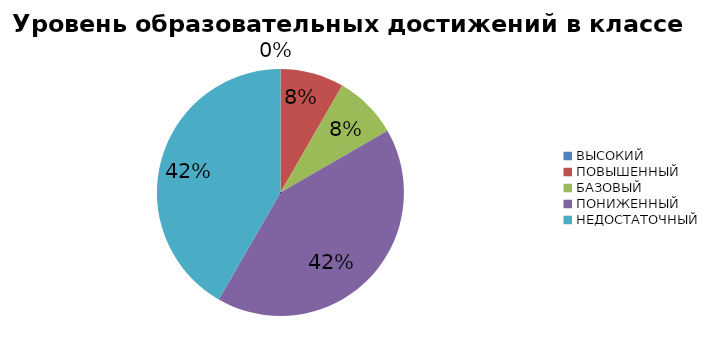
| Category | Series 0 |
|---|---|
| ВЫСОКИЙ | 0 |
| ПОВЫШЕННЫЙ | 8.333 |
| БАЗОВЫЙ | 8.333 |
| ПОНИЖЕННЫЙ | 41.667 |
| НЕДОСТАТОЧНЫЙ | 41.667 |